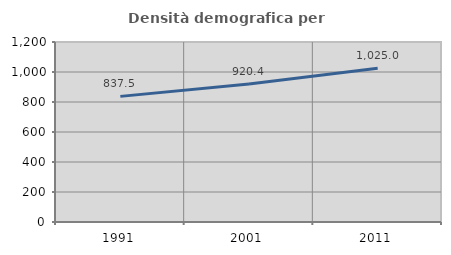
| Category | Densità demografica |
|---|---|
| 1991.0 | 837.501 |
| 2001.0 | 920.376 |
| 2011.0 | 1024.958 |